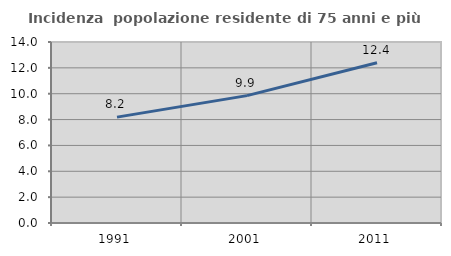
| Category | Incidenza  popolazione residente di 75 anni e più |
|---|---|
| 1991.0 | 8.191 |
| 2001.0 | 9.851 |
| 2011.0 | 12.397 |